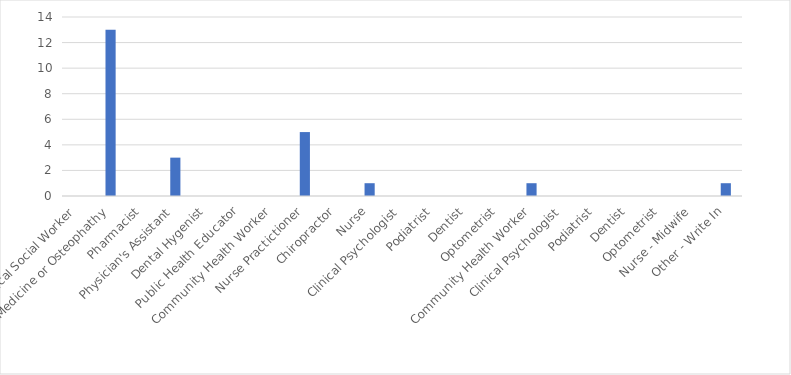
| Category | Number of Responses |
|---|---|
| Clinical Social Worker | 0 |
| Doctor of Medicine or Osteophathy | 13 |
| Pharmacist | 0 |
| Physician's Assistant | 3 |
| Dental Hygenist | 0 |
| Public Health Educator | 0 |
| Community Health Worker | 0 |
| Nurse Practictioner | 5 |
| Chiropractor | 0 |
| Nurse | 1 |
| Clinical Psychologist | 0 |
| Podiatrist | 0 |
| Dentist | 0 |
| Optometrist | 0 |
| Community Health Worker | 1 |
| Clinical Psychologist | 0 |
| Podiatrist | 0 |
| Dentist | 0 |
| Optometrist | 0 |
| Nurse - Midwife | 0 |
| Other - Write In | 1 |